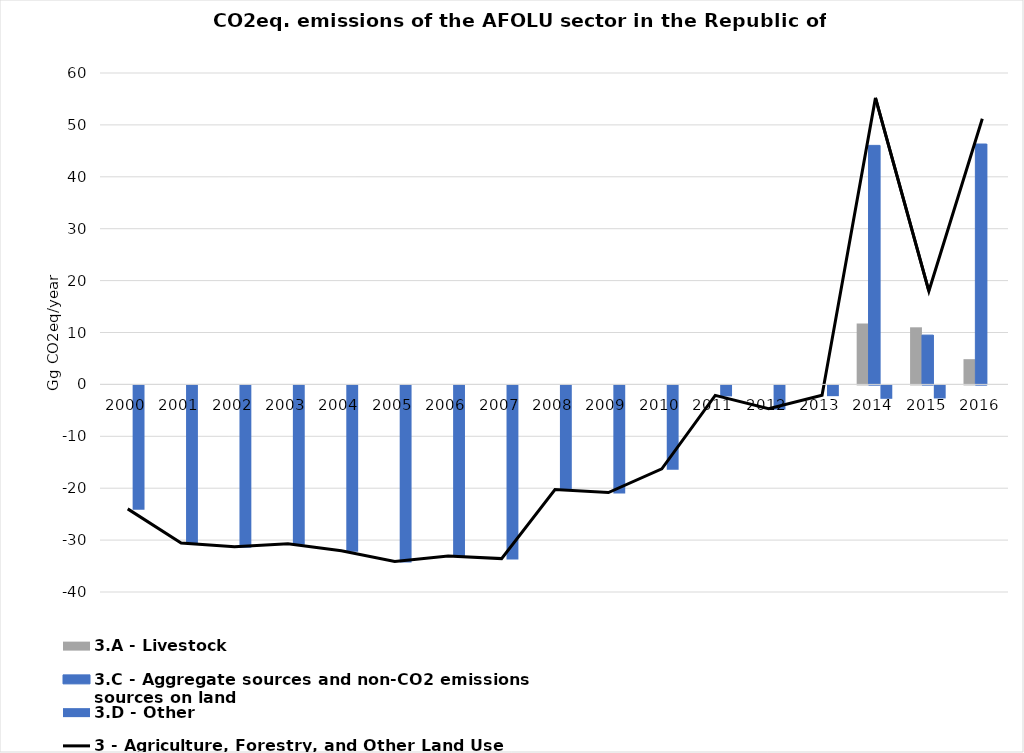
| Category | 3.A - Livestock | 3.C - Aggregate sources and non-CO2 emissions sources on land | 3.D - Other |
|---|---|---|---|
| 0 | 0 | 0 | -23.982 |
| 1 | 0 | 0 | -30.574 |
| 2 | 0 | 0 | -31.285 |
| 3 | 0 | 0 | -30.683 |
| 4 | 0 | 0 | -32.058 |
| 5 | 0 | 0 | -34.107 |
| 6 | 0 | 0 | -33.047 |
| 7 | 0 | 0 | -33.563 |
| 8 | 0 | 0 | -20.267 |
| 9 | 0 | 0 | -20.841 |
| 10 | 0 | 0 | -16.255 |
| 11 | 0 | 0 | -2.117 |
| 12 | 0 | 0 | -4.674 |
| 13 | 0 | 0 | -2.075 |
| 14 | 11.735 | 46.053 | -2.584 |
| 15 | 11.002 | 9.499 | -2.514 |
| 16 | 4.862 | 46.315 | 0 |